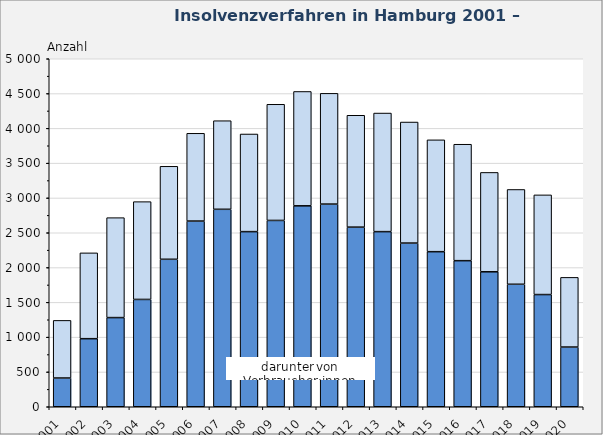
| Category | darunter von Verbraucher:innen | Insgesamt |
|---|---|---|
| 2001.0 | 413 | 828 |
| 2002.0 | 978 | 1233 |
| 2003.0 | 1281 | 1436 |
| 2004.0 | 1542 | 1405 |
| 2005.0 | 2119 | 1336 |
| 2006.0 | 2668 | 1261 |
| 2007.0 | 2837 | 1273 |
| 2008.0 | 2516 | 1403 |
| 2009.0 | 2677 | 1669 |
| 2010.0 | 2887 | 1643 |
| 2011.0 | 2912 | 1591 |
| 2012.0 | 2581 | 1607 |
| 2013.0 | 2516 | 1704 |
| 2014.0 | 2352 | 1739 |
| 2015.0 | 2228 | 1607 |
| 2016.0 | 2099 | 1673 |
| 2017.0 | 1939 | 1428 |
| 2018.0 | 1760 | 1362 |
| 2019.0 | 1612 | 1432 |
| 2020.0 | 858 | 1001 |